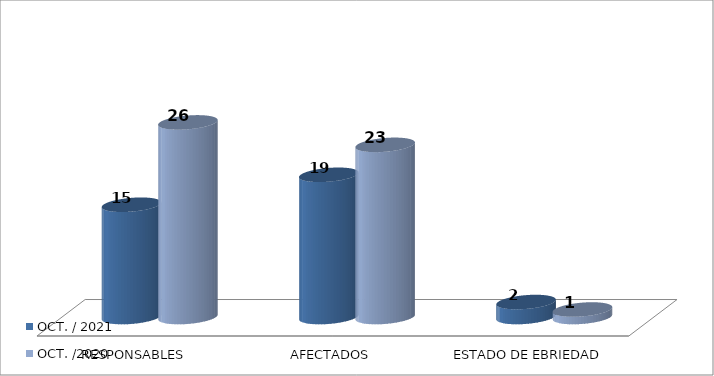
| Category | OCT. / 2021 | OCT. /2020 |
|---|---|---|
| RESPONSABLES | 15 | 26 |
| AFECTADOS | 19 | 23 |
| ESTADO DE EBRIEDAD | 2 | 1 |